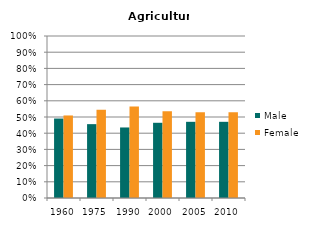
| Category | Male | Female |
|---|---|---|
| 1960.0 | 0.491 | 0.509 |
| 1975.0 | 0.456 | 0.544 |
| 1990.0 | 0.435 | 0.565 |
| 2000.0 | 0.464 | 0.536 |
| 2005.0 | 0.47 | 0.53 |
| 2010.0 | 0.47 | 0.53 |